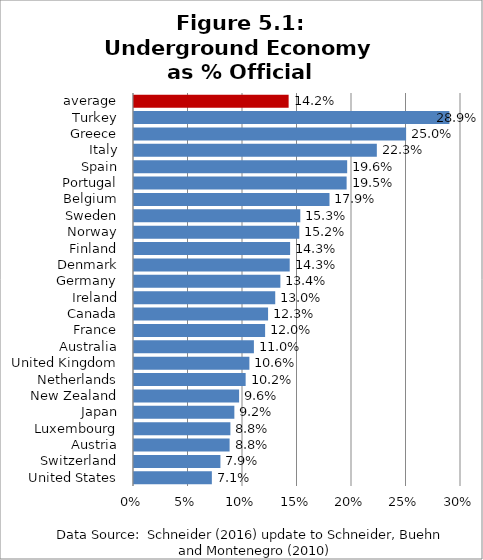
| Category | Underground Economy as % Official GDP |
|---|---|
| United States | 0.071 |
| Switzerland | 0.079 |
| Austria | 0.088 |
| Luxembourg | 0.088 |
| Japan | 0.092 |
| New Zealand | 0.096 |
| Netherlands | 0.102 |
| United Kingdom | 0.106 |
| Australia | 0.11 |
| France | 0.12 |
| Canada | 0.123 |
| Ireland | 0.13 |
| Germany | 0.134 |
| Denmark | 0.143 |
| Finland | 0.143 |
| Norway | 0.152 |
| Sweden | 0.153 |
| Belgium | 0.179 |
| Portugal | 0.195 |
| Spain | 0.196 |
| Italy | 0.223 |
| Greece | 0.25 |
| Turkey | 0.289 |
| average | 0.142 |